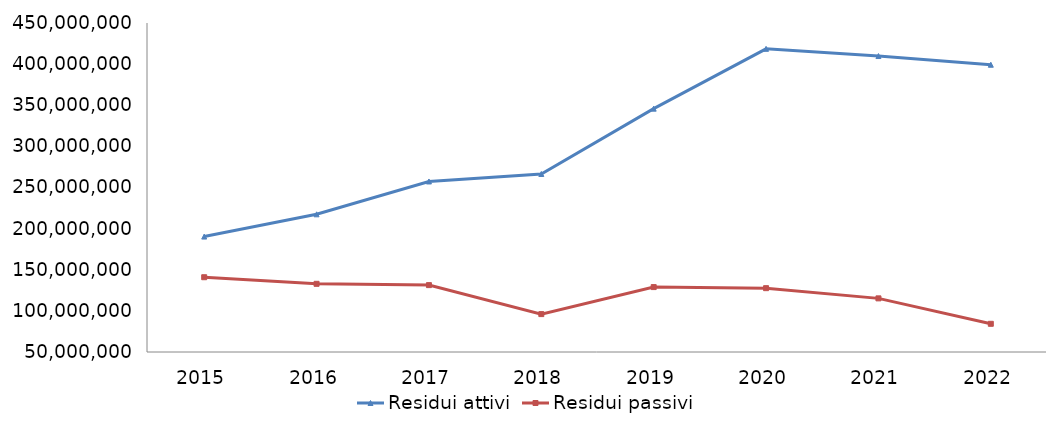
| Category | Residui attivi | Residui passivi |
|---|---|---|
| 2015.0 | 190348755.29 | 140909554.7 |
| 2016.0 | 217400507.5 | 132886969.88 |
| 2017.0 | 257331335.33 | 131325821.88 |
| 2018.0 | 266437997.34 | 96070040.68 |
| 2019.0 | 345860981.12 | 128915514.33 |
| 2020.0 | 418596933.63 | 127604536.82 |
| 2021.0 | 409839833.45 | 115207650.83 |
| 2022.0 | 399246823.74 | 84289108.18 |